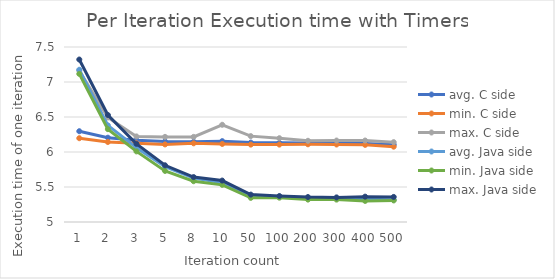
| Category | avg. C side | min. C side | max. C side | avg. Java side | min. Java side | max. Java side |
|---|---|---|---|---|---|---|
| 1.0 | 6.297 | 6.197 | 7.162 | 7.175 | 7.116 | 7.321 |
| 2.0 | 6.204 | 6.143 | 6.493 | 6.38 | 6.326 | 6.528 |
| 3.0 | 6.169 | 6.125 | 6.222 | 6.06 | 6.009 | 6.116 |
| 5.0 | 6.152 | 6.108 | 6.216 | 5.79 | 5.73 | 5.81 |
| 8.0 | 6.148 | 6.124 | 6.216 | 5.629 | 5.582 | 5.642 |
| 10.0 | 6.155 | 6.115 | 6.389 | 5.559 | 5.53 | 5.592 |
| 50.0 | 6.135 | 6.106 | 6.227 | 5.382 | 5.345 | 5.391 |
| 100.0 | 6.131 | 6.106 | 6.197 | 5.358 | 5.348 | 5.371 |
| 200.0 | 6.127 | 6.11 | 6.16 | 5.344 | 5.32 | 5.356 |
| 300.0 | 6.13 | 6.107 | 6.164 | 5.341 | 5.32 | 5.351 |
| 400.0 | 6.122 | 6.102 | 6.164 | 5.324 | 5.301 | 5.362 |
| 500.0 | 6.104 | 6.076 | 6.141 | 5.317 | 5.308 | 5.358 |